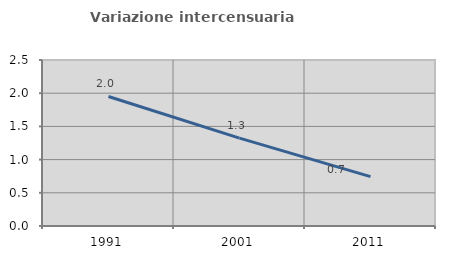
| Category | Variazione intercensuaria annua |
|---|---|
| 1991.0 | 1.951 |
| 2001.0 | 1.324 |
| 2011.0 | 0.743 |